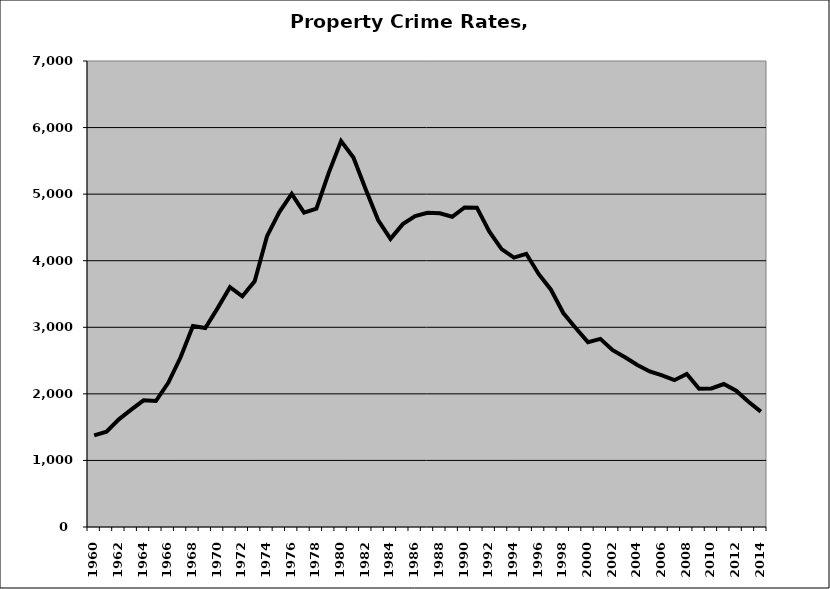
| Category | Property |
|---|---|
| 1960.0 | 1376.496 |
| 1961.0 | 1431.374 |
| 1962.0 | 1617.694 |
| 1963.0 | 1762.257 |
| 1964.0 | 1902.694 |
| 1965.0 | 1892.737 |
| 1966.0 | 2166.628 |
| 1967.0 | 2549.136 |
| 1968.0 | 3018.225 |
| 1969.0 | 2989.661 |
| 1970.0 | 3288.206 |
| 1971.0 | 3603.082 |
| 1972.0 | 3465.685 |
| 1973.0 | 3690.626 |
| 1974.0 | 4368.295 |
| 1975.0 | 4731.301 |
| 1976.0 | 5003.749 |
| 1977.0 | 4721.831 |
| 1978.0 | 4783.69 |
| 1979.0 | 5319.394 |
| 1980.0 | 5796.969 |
| 1981.0 | 5549.156 |
| 1982.0 | 5068.782 |
| 1983.0 | 4610.284 |
| 1984.0 | 4327.758 |
| 1985.0 | 4549.947 |
| 1986.0 | 4668.819 |
| 1987.0 | 4720.477 |
| 1988.0 | 4712.526 |
| 1989.0 | 4660.445 |
| 1990.0 | 4799.663 |
| 1991.0 | 4796.546 |
| 1992.0 | 4438.542 |
| 1993.0 | 4173.969 |
| 1994.0 | 4046.761 |
| 1995.0 | 4103.914 |
| 1996.0 | 3801.415 |
| 1997.0 | 3564.361 |
| 1998.0 | 3213.925 |
| 1999.0 | 2988.096 |
| 2000.0 | 2776.649 |
| 2001.0 | 2826.316 |
| 2002.0 | 2655.49 |
| 2003.0 | 2549.635 |
| 2004.0 | 2433.034 |
| 2005.0 | 2336.981 |
| 2006.0 | 2278.43 |
| 2007.0 | 2205.523 |
| 2008.0 | 2298.486 |
| 2009.0 | 2075.763 |
| 2010.0 | 2081.94 |
| 2011.0 | 2147.412 |
| 2012.0 | 2046.528 |
| 2013.0 | 1881.097 |
| 2014.0 | 1734.056 |